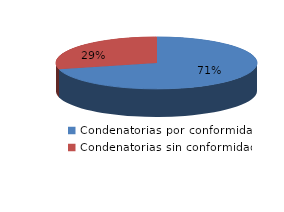
| Category | Series 0 |
|---|---|
| 0 | 801 |
| 1 | 327 |